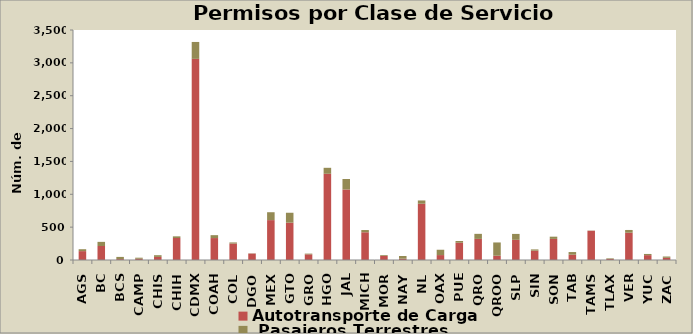
| Category | Autotransporte de Carga  |  Pasajeros Terrestres |
|---|---|---|
| AGS | 135 | 29 |
| BC | 213 | 63 |
| BCS | 14 | 33 |
| CAMP | 19 | 16 |
| CHIS | 47 | 26 |
| CHIH | 335 | 25 |
| CDMX | 3061 | 257 |
| COAH | 334 | 44 |
| COL | 250 | 17 |
| DGO | 98 | 3 |
| MEX | 607 | 120 |
| GTO | 568 | 151 |
| GRO | 86 | 11 |
| HGO | 1312 | 91 |
| JAL | 1073 | 160 |
| MICH | 422 | 34 |
| MOR | 62 | 12 |
| NAY | 20 | 41 |
| NL | 856 | 50 |
| OAX | 75 | 81 |
| PUE | 263 | 26 |
| QRO | 321 | 77 |
| QROO | 65 | 202 |
| SLP | 307 | 90 |
| SIN | 142 | 19 |
| SON | 321 | 34 |
| TAB | 81 | 40 |
| TAMS | 445 | 3 |
| TLAX | 16 | 9 |
| VER | 415 | 42 |
| YUC | 74 | 18 |
| ZAC | 33 | 20 |